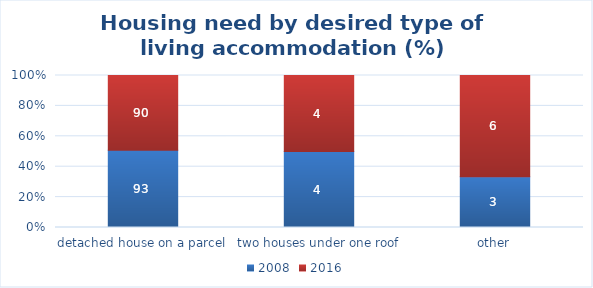
| Category | 2008 | 2016 |
|---|---|---|
| detached house on a parcel | 93 | 90 |
| two houses under one roof | 4 | 4 |
| other | 3 | 6 |